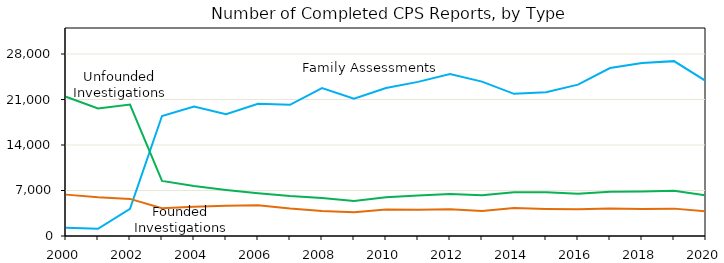
| Category | Family Assessments | Founded Investigations | Unfounded Investigations |
|---|---|---|---|
| 2000.0 | 1274 | 6365 | 21430 |
| 2001.0 | 1116 | 5963 | 19607 |
| 2002.0 | 4192 | 5708 | 20220 |
| 2003.0 | 18457 | 4286 | 8482 |
| 2004.0 | 19931 | 4507 | 7710 |
| 2005.0 | 18753 | 4661 | 7093 |
| 2006.0 | 20337 | 4741 | 6575 |
| 2007.0 | 20186 | 4230 | 6138 |
| 2008.0 | 22761 | 3857 | 5853 |
| 2009.0 | 21106 | 3651 | 5398 |
| 2010.0 | 22765 | 4059 | 5965 |
| 2011.0 | 23712 | 4039 | 6212 |
| 2012.0 | 24911 | 4103 | 6464 |
| 2013.0 | 23747 | 3863 | 6251 |
| 2014.0 | 21867 | 4312 | 6728 |
| 2015.0 | 22114 | 4173 | 6733 |
| 2016.0 | 23282 | 4113 | 6482 |
| 2017.0 | 25847 | 4230 | 6817 |
| 2018.0 | 26613 | 4154 | 6836 |
| 2019.0 | 26902 | 4211 | 6961 |
| 2020.0 | 23826 | 3789 | 6265 |